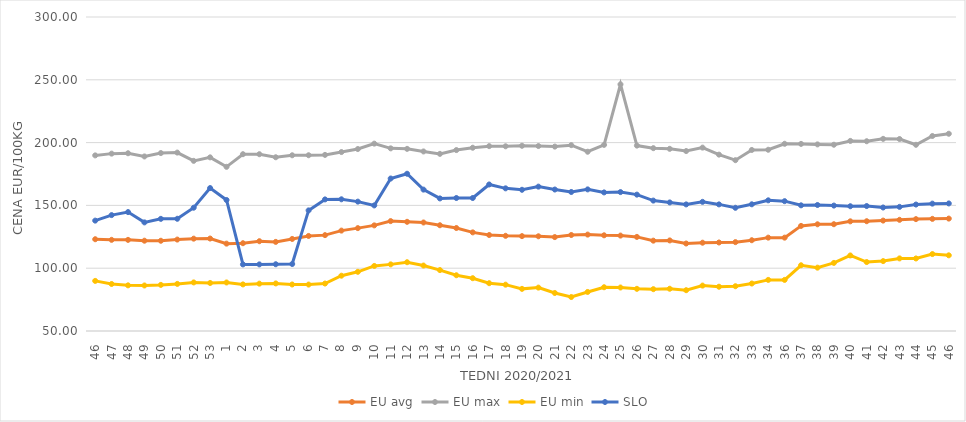
| Category | EU avg | EU max | EU min | SLO |
|---|---|---|---|---|
| 46.0 | 123.07 | 189.82 | 89.89 | 137.88 |
| 47.0 | 122.58 | 191.22 | 87.43 | 142.27 |
| 48.0 | 122.553 | 191.52 | 86.35 | 144.69 |
| 49.0 | 121.893 | 188.97 | 86.24 | 136.47 |
| 50.0 | 121.851 | 191.67 | 86.72 | 139.29 |
| 51.0 | 122.8 | 192.06 | 87.5 | 139.35 |
| 52.0 | 123.52 | 185.468 | 88.67 | 148.16 |
| 53.0 | 123.611 | 188.25 | 88.23 | 163.81 |
| 1.0 | 119.553 | 180.72 | 88.64 | 154.31 |
| 2.0 | 119.893 | 190.77 | 87.1 | 103.02 |
| 3.0 | 121.489 | 190.76 | 87.7 | 103.03 |
| 4.0 | 120.954 | 188.33 | 87.88 | 103.15 |
| 5.0 | 123.293 | 189.91 | 87.04 | 103.34 |
| 6.0 | 125.679 | 189.94 | 86.97 | 146.03 |
| 7.0 | 126.33 | 190.21 | 87.79 | 154.77 |
| 8.0 | 129.933 | 192.48 | 94.02 | 154.86 |
| 9.0 | 131.908 | 194.884 | 97.12 | 153 |
| 10.0 | 134.098 | 199.17 | 101.79 | 149.98 |
| 11.0 | 137.49 | 195.419 | 103.05 | 171.4 |
| 12.0 | 136.929 | 195.013 | 104.76 | 175.2 |
| 13.0 | 136.39 | 192.952 | 102.11 | 162.57 |
| 14.0 | 134.198 | 191.034 | 98.5 | 155.55 |
| 15.0 | 132.003 | 194.047 | 94.39 | 155.88 |
| 16.0 | 128.53 | 195.913 | 92.04 | 155.88 |
| 17.0 | 126.415 | 197.188 | 88.07 | 166.66 |
| 18.0 | 125.787 | 197.055 | 86.89 | 163.58 |
| 19.0 | 125.54 | 197.478 | 83.546 | 162.44 |
| 20.0 | 125.412 | 197.263 | 84.55 | 164.94 |
| 21.0 | 124.768 | 196.821 | 80.264 | 162.64 |
| 22.0 | 126.43 | 197.963 | 77.048 | 160.68 |
| 23.0 | 126.76 | 192.72 | 81.087 | 162.75 |
| 24.0 | 126.19 | 198.186 | 84.83 | 160.34 |
| 25.0 | 125.97 | 246.36 | 84.63 | 160.6 |
| 26.0 | 124.92 | 197.607 | 83.57 | 158.57 |
| 27.0 | 121.922 | 195.566 | 83.3 | 153.83 |
| 28.0 | 122.106 | 195.043 | 83.64 | 152.35 |
| 29.0 | 119.659 | 193.272 | 82.49 | 150.79 |
| 30.0 | 120.3 | 196.01 | 86.16 | 152.82 |
| 31.0 | 120.473 | 190.42 | 85.26 | 150.8 |
| 32.0 | 120.756 | 186 | 85.65 | 148.1 |
| 33.0 | 122.274 | 194.145 | 87.8 | 150.88 |
| 34.0 | 124.332 | 194.304 | 90.69 | 154.04 |
| 36.0 | 124.332 | 199.06 | 90.69 | 153.37 |
| 37.0 | 133.685 | 198.97 | 102.334 | 150.06 |
| 38.0 | 134.959 | 198.57 | 100.43 | 150.32 |
| 39.0 | 135.021 | 198.3 | 104.21 | 149.86 |
| 40.0 | 137.315 | 201.34 | 110.15 | 149.34 |
| 41.0 | 137.411 | 201.081 | 104.9 | 149.48 |
| 42.0 | 137.908 | 202.98 | 105.65 | 148.32 |
| 43.0 | 138.52 | 202.856 | 107.8 | 148.83 |
| 44.0 | 139.076 | 198.26 | 107.75 | 150.69 |
| 45.0 | 139.275 | 205.257 | 111.25 | 151.41 |
| 46.0 | 139.501 | 207.046 | 110.26 | 151.56 |